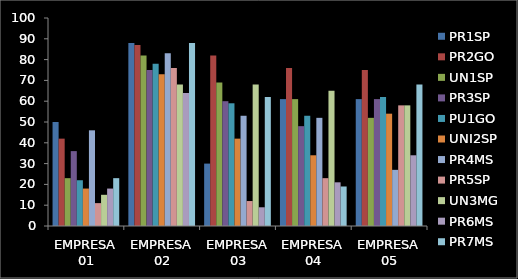
| Category | PR1SP | PR2GO | UN1SP | PR3SP | PU1GO | UNI2SP | PR4MS | PR5SP | UN3MG | PR6MS | PR7MS |
|---|---|---|---|---|---|---|---|---|---|---|---|
| EMPRESA 01 | 50 | 42 | 23 | 36 | 22 | 18 | 46 | 11 | 15 | 18 | 23 |
| EMPRESA 02 | 88 | 87 | 82 | 75 | 78 | 73 | 83 | 76 | 68 | 64 | 88 |
| EMPRESA 03 | 30 | 82 | 69 | 60 | 59 | 42 | 53 | 12 | 68 | 9 | 62 |
| EMPRESA 04 | 61 | 76 | 61 | 48 | 53 | 34 | 52 | 23 | 65 | 21 | 19 |
| EMPRESA 05 | 61 | 75 | 52 | 61 | 62 | 54 | 27 | 58 | 58 | 34 | 68 |